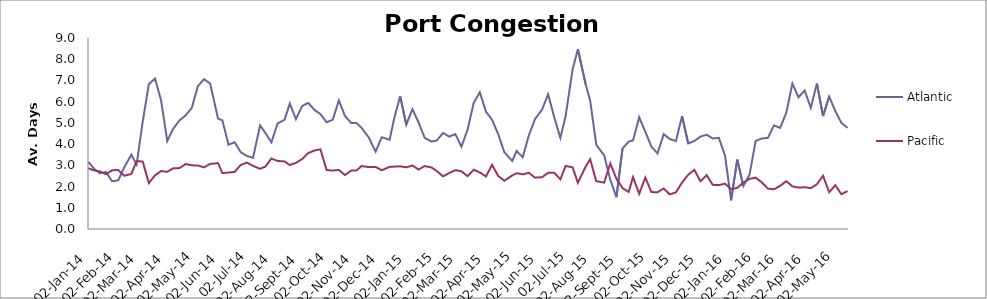
| Category | Atlantic  | Pacific |
|---|---|---|
| 2014-01-02 | 3.167 | 2.863 |
| 2014-01-08 | 2.854 | 2.767 |
| 2014-01-15 | 2.625 | 2.712 |
| 2014-01-22 | 2.688 | 2.582 |
| 2014-01-29 | 2.25 | 2.767 |
| 2014-02-05 | 2.292 | 2.781 |
| 2014-02-12 | 2.917 | 2.507 |
| 2014-02-20 | 3.5 | 2.596 |
| 2014-02-26 | 3.042 | 3.199 |
| 2014-03-05 | 5.059 | 3.178 |
| 2014-03-12 | 6.824 | 2.164 |
| 2014-03-19 | 7.088 | 2.527 |
| 2014-03-26 | 6.059 | 2.733 |
| 2014-04-02 | 4.147 | 2.692 |
| 2014-04-09 | 4.735 | 2.863 |
| 2014-04-16 | 5.118 | 2.87 |
| 2014-04-23 | 5.353 | 3.062 |
| 2014-04-30 | 5.706 | 3 |
| 2014-05-07 | 6.735 | 2.993 |
| 2014-05-14 | 7.059 | 2.904 |
| 2014-05-21 | 6.853 | 3.068 |
| 2014-05-30 | 5.206 | 3.103 |
| 2014-06-04 | 5.118 | 2.637 |
| 2014-06-11 | 3.971 | 2.658 |
| 2014-06-18 | 4.088 | 2.692 |
| 2014-06-25 | 3.618 | 3.021 |
| 2014-07-02 | 3.441 | 3.13 |
| 2014-07-09 | 3.353 | 2.973 |
| 2014-07-17 | 4.882 | 2.836 |
| 2014-07-23 | 4.529 | 2.938 |
| 2014-07-30 | 4.088 | 3.322 |
| 2014-08-06 | 4.971 | 3.205 |
| 2014-08-14 | 5.147 | 3.185 |
| 2014-08-20 | 5.912 | 3.014 |
| 2014-08-27 | 5.176 | 3.116 |
| 2014-09-03 | 5.794 | 3.295 |
| 2014-09-10 | 5.941 | 3.575 |
| 2014-09-17 | 5.618 | 3.699 |
| 2014-09-24 | 5.412 | 3.753 |
| 2014-10-01 | 5.029 | 2.781 |
| 2014-10-08 | 5.147 | 2.753 |
| 2014-10-15 | 6.059 | 2.785 |
| 2014-10-22 | 5.324 | 2.541 |
| 2014-10-29 | 5 | 2.753 |
| 2014-11-04 | 5 | 2.753 |
| 2014-11-10 | 4.765 | 2.966 |
| 2014-11-18 | 4.324 | 2.918 |
| 2014-11-26 | 3.647 | 2.925 |
| 2014-12-03 | 4.324 | 2.767 |
| 2014-12-12 | 4.206 | 2.932 |
| 2014-12-17 | 5.176 | 2.938 |
| 2014-12-24 | 6.265 | 2.952 |
| 2014-12-31 | 4.912 | 2.904 |
| 2015-01-07 | 5.647 | 2.993 |
| 2015-01-14 | 5.029 | 2.801 |
| 2015-01-21 | 4.294 | 2.966 |
| 2015-01-29 | 4.118 | 2.897 |
| 2015-02-04 | 4.176 | 2.726 |
| 2015-02-11 | 4.529 | 2.479 |
| 2015-02-18 | 4.353 | 2.637 |
| 2015-02-25 | 4.471 | 2.774 |
| 2015-03-04 | 3.882 | 2.719 |
| 2015-03-11 | 4.676 | 2.486 |
| 2015-03-18 | 5.941 | 2.795 |
| 2015-03-25 | 6.441 | 2.664 |
| 2015-04-01 | 5.529 | 2.473 |
| 2015-04-08 | 5.147 | 3.027 |
| 2015-04-15 | 4.471 | 2.5 |
| 2015-04-22 | 3.618 | 2.274 |
| 2015-05-01 | 3.206 | 2.521 |
| 2015-05-06 | 3.676 | 2.63 |
| 2015-05-13 | 3.382 | 2.575 |
| 2015-05-20 | 4.412 | 2.651 |
| 2015-05-27 | 5.176 | 2.418 |
| 2015-06-04 | 5.618 | 2.442 |
| 2015-06-11 | 6.353 | 2.645 |
| 2015-06-18 | 5.265 | 2.651 |
| 2015-06-25 | 4.294 | 2.342 |
| 2015-07-01 | 5.324 | 2.973 |
| 2015-07-09 | 7.529 | 2.904 |
| 2015-07-15 | 8.471 | 2.175 |
| 2015-07-24 | 6.794 | 2.952 |
| 2015-07-29 | 6.059 | 3.288 |
| 2015-08-05 | 3.971 | 2.253 |
| 2015-08-14 | 3.471 | 2.185 |
| 2015-08-21 | 2.324 | 3.089 |
| 2015-08-28 | 1.5 | 2.37 |
| 2015-09-04 | 3.794 | 1.925 |
| 2015-09-11 | 4.118 | 1.747 |
| 2015-09-16 | 4.176 | 2.445 |
| 2015-09-23 | 5.265 | 1.658 |
| 2015-09-30 | 4.588 | 2.418 |
| 2015-10-07 | 3.882 | 1.74 |
| 2015-10-14 | 3.559 | 1.733 |
| 2015-10-21 | 4.471 | 1.911 |
| 2015-10-28 | 4.235 | 1.63 |
| 2015-11-04 | 4.147 | 1.726 |
| 2015-11-11 | 5.324 | 2.192 |
| 2015-11-18 | 4.029 | 2.555 |
| 2015-11-25 | 4.147 | 2.788 |
| 2015-12-02 | 4.353 | 2.247 |
| 2015-12-09 | 4.441 | 2.541 |
| 2015-12-16 | 4.265 | 2.082 |
| 2015-12-23 | 4.294 | 2.068 |
| 2015-12-30 | 3.471 | 2.137 |
| 2016-01-06 | 1.353 | 1.884 |
| 2016-01-13 | 3.265 | 1.938 |
| 2016-01-20 | 2.029 | 2.185 |
| 2016-01-27 | 2.559 | 2.363 |
| 2016-02-03 | 4.147 | 2.418 |
| 2016-02-10 | 4.265 | 2.199 |
| 2016-02-17 | 4.294 | 1.904 |
| 2016-02-24 | 4.882 | 1.87 |
| 2016-03-02 | 4.765 | 2.034 |
| 2016-03-09 | 5.471 | 2.253 |
| 2016-03-16 | 6.853 | 2.007 |
| 2016-03-23 | 6.206 | 1.952 |
| 2016-03-30 | 6.529 | 1.966 |
| 2016-04-06 | 5.706 | 1.925 |
| 2016-04-13 | 6.853 | 2.11 |
| 2016-04-20 | 5.324 | 2.507 |
| 2016-04-27 | 6.235 | 1.733 |
| 2016-05-04 | 5.559 | 2.062 |
| 2016-05-11 | 5 | 1.637 |
| 2016-05-18 | 4.765 | 1.788 |